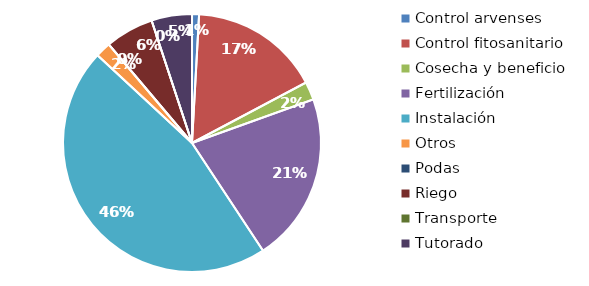
| Category | Valor |
|---|---|
| Control arvenses | 432000 |
| Control fitosanitario | 8055000 |
| Cosecha y beneficio | 1120000 |
| Fertilización | 10450000 |
| Instalación | 22750000 |
| Otros | 950000 |
| Podas | 0 |
| Riego | 3000000 |
| Transporte | 0 |
| Tutorado | 2500000 |